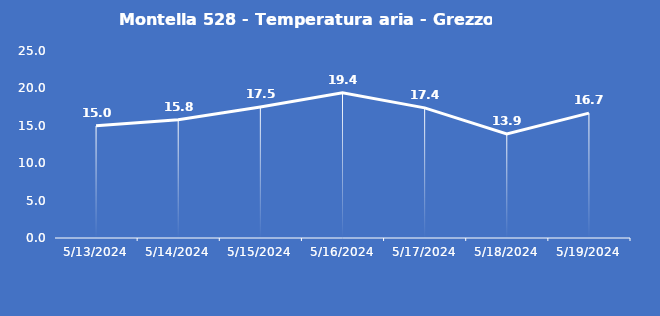
| Category | Montella 528 - Temperatura aria - Grezzo (°C) |
|---|---|
| 5/13/24 | 15 |
| 5/14/24 | 15.8 |
| 5/15/24 | 17.5 |
| 5/16/24 | 19.4 |
| 5/17/24 | 17.4 |
| 5/18/24 | 13.9 |
| 5/19/24 | 16.7 |